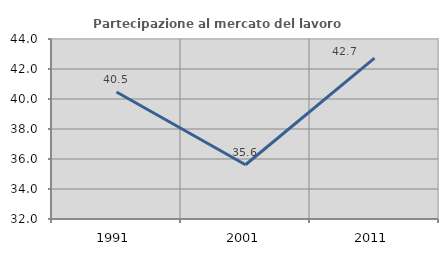
| Category | Partecipazione al mercato del lavoro  femminile |
|---|---|
| 1991.0 | 40.468 |
| 2001.0 | 35.618 |
| 2011.0 | 42.729 |